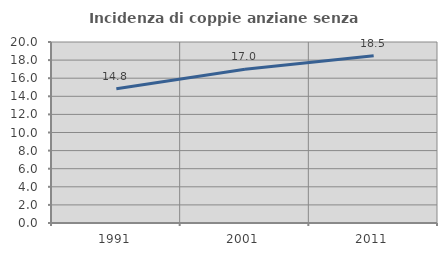
| Category | Incidenza di coppie anziane senza figli  |
|---|---|
| 1991.0 | 14.825 |
| 2001.0 | 16.99 |
| 2011.0 | 18.477 |